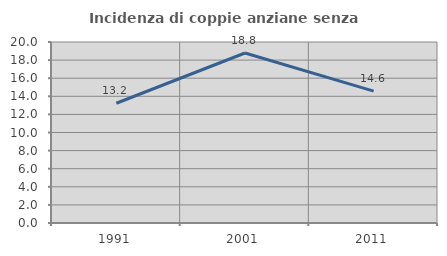
| Category | Incidenza di coppie anziane senza figli  |
|---|---|
| 1991.0 | 13.231 |
| 2001.0 | 18.785 |
| 2011.0 | 14.566 |